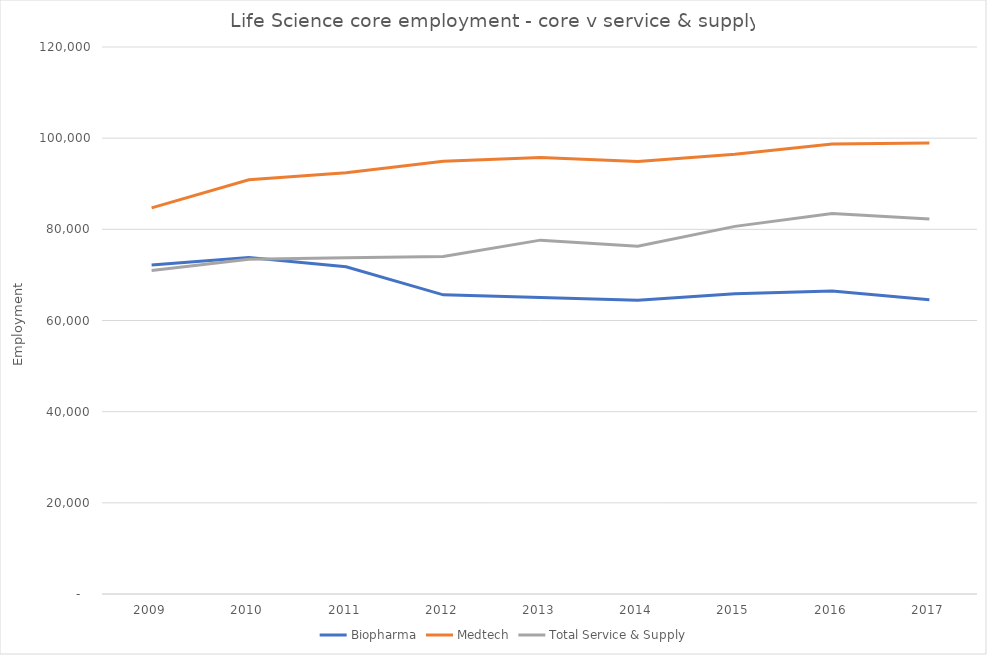
| Category | Biopharma | Medtech | Total Service & Supply |
|---|---|---|---|
| 2009 | 72154 | 84717 | 70984 |
| 2010 | 73812 | 90878 | 73430 |
| 2011 | 71795 | 92408 | 73784 |
| 2012 | 65627 | 94932 | 74053 |
| 2013 | 65057 | 95763 | 77630 |
| 2014 | 64455 | 94873 | 76284 |
| 2015 | 65849 | 96463 | 80651 |
| 2016 | 66472 | 98695 | 83498 |
| 2017 | 64539 | 98956 | 82275 |